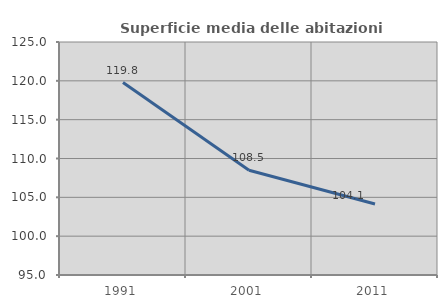
| Category | Superficie media delle abitazioni occupate |
|---|---|
| 1991.0 | 119.775 |
| 2001.0 | 108.487 |
| 2011.0 | 104.148 |